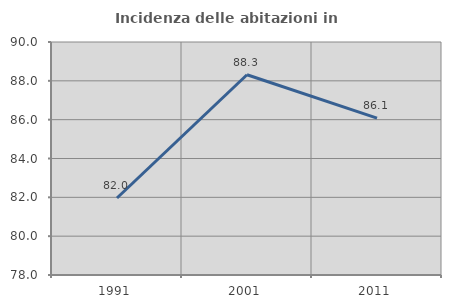
| Category | Incidenza delle abitazioni in proprietà  |
|---|---|
| 1991.0 | 81.967 |
| 2001.0 | 88.312 |
| 2011.0 | 86.076 |